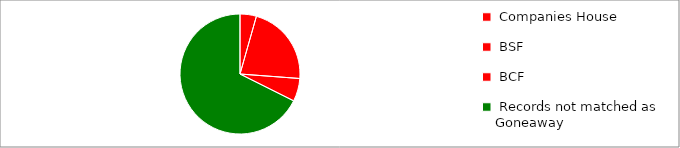
| Category | Series 0 |
|---|---|
| 0 | 448 |
| 1 | 2214 |
| 2 | 628 |
| 3 | 6870 |